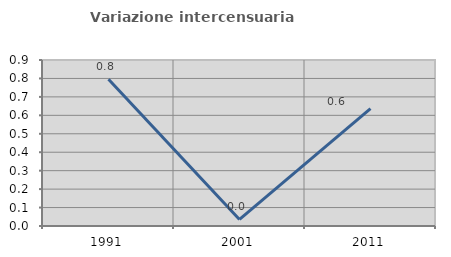
| Category | Variazione intercensuaria annua |
|---|---|
| 1991.0 | 0.795 |
| 2001.0 | 0.035 |
| 2011.0 | 0.636 |